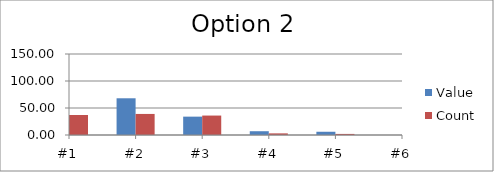
| Category | Value | Count |
|---|---|---|
| #1 | 100 | 37 |
| #2 | 68 | 39 |
| #3 | 34 | 36 |
| #4 | 7 | 3 |
| #5 | 6 | 2 |
| #6 | 0 | 41 |